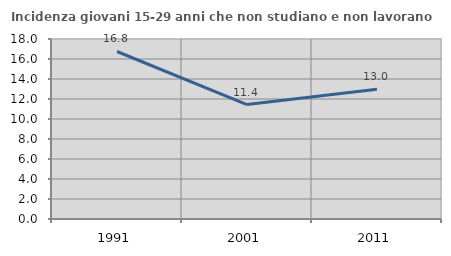
| Category | Incidenza giovani 15-29 anni che non studiano e non lavorano  |
|---|---|
| 1991.0 | 16.751 |
| 2001.0 | 11.443 |
| 2011.0 | 12.976 |